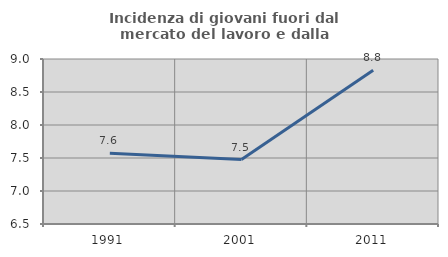
| Category | Incidenza di giovani fuori dal mercato del lavoro e dalla formazione  |
|---|---|
| 1991.0 | 7.574 |
| 2001.0 | 7.477 |
| 2011.0 | 8.829 |